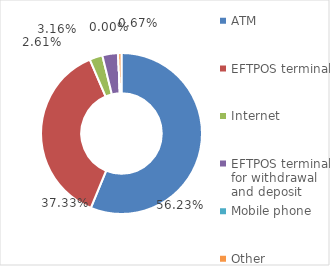
| Category | Value of transactions, in HRK |
|---|---|
| ATM | 92554970855 |
| EFTPOS terminal | 61445840517 |
| Internet | 4297930612 |
| EFTPOS terminal for withdrawal and deposit | 5205429816 |
| Mobile phone | 4262561 |
| Other | 1101874395 |